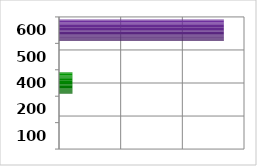
| Category | Series 0 |
|---|---|
| 100.0 | 0 |
| 200.0 | 0 |
| 400.0 | 435320 |
| 500.0 | 0 |
| 600.0 | 5346294.21 |